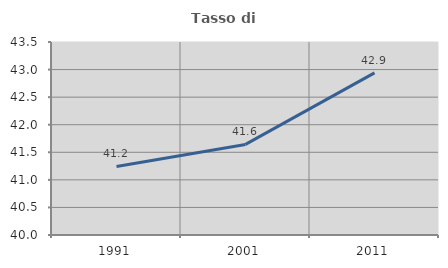
| Category | Tasso di occupazione   |
|---|---|
| 1991.0 | 41.243 |
| 2001.0 | 41.643 |
| 2011.0 | 42.94 |